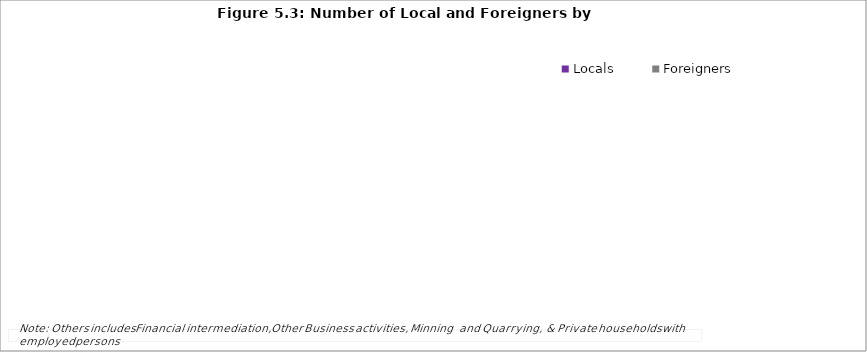
| Category | Locals | Foreigners |
|---|---|---|
| Wholesale and retail trade | 30118.09 | 7032.68 |
| Manufacturing | 28681.79 | 6336.38 |
| Hotels and Restaurants | 15892.11 | 15216.36 |
| Transport, Storage and Communication | 19416.63 | 1388.76 |
| Construction | 10045.71 | 8454.34 |
| Fishing | 13504.25 | 144 |
| Agriculture, Hunting and Forestry | 9603.22 | 336.29 |
| Other Community, Social and Personal service activities | 5167.95 | 4518.17 |
| Real estate, Renting and Business activities | 4846.48 | 1117.86 |
| Education | 3854.04 | 533.36 |
| Health and Social work | 1070.85 | 806.24 |
| Electricity, Gas and Water suppy | 1626.92 | 11 |
| Others | 1628.69 | 163 |